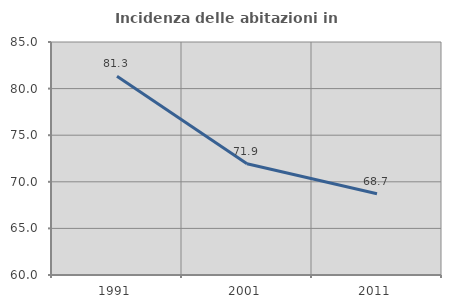
| Category | Incidenza delle abitazioni in proprietà  |
|---|---|
| 1991.0 | 81.313 |
| 2001.0 | 71.935 |
| 2011.0 | 68.71 |